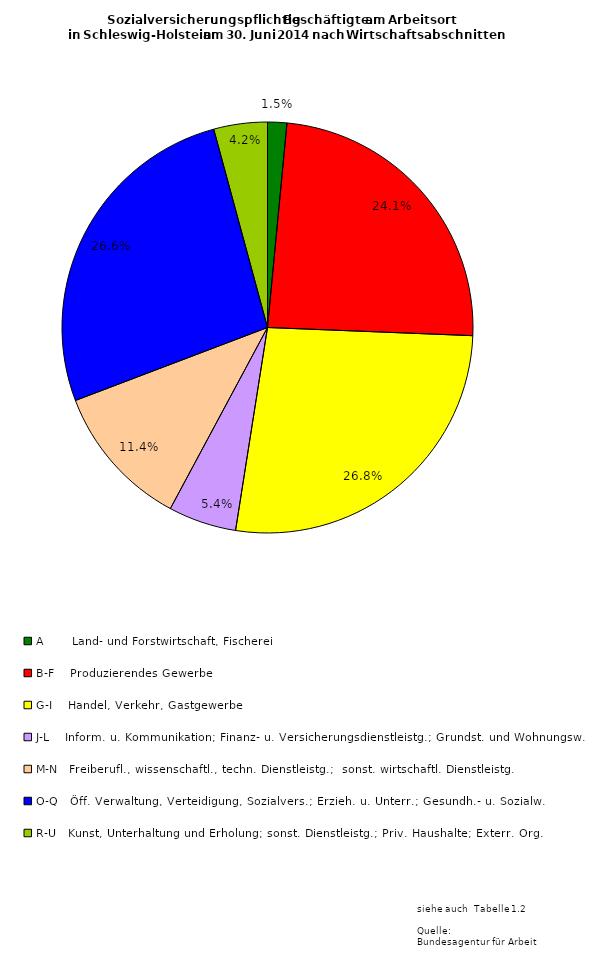
| Category | Series 0 | Series 1 | Series 2 |
|---|---|---|---|
| A       Land- und Forstwirtschaft, Fischerei | 13576 | 3804 | 9772 |
| B-F    Produzierendes Gewerbe | 216386 | 49088 | 167298 |
| G-I    Handel, Verkehr, Gastgewerbe | 240854 | 109180 | 131674 |
| J-L    Inform. u. Kommunikation; Finanz- u. Versicherungsdienstleistg.; Grundst. und Wohnungsw. | 48009 | 23176 | 24833 |
| M-N   Freiberufl., wissenschaftl., techn. Dienstleistg.;  sonst. wirtschaftl. Dienstleistg.  | 102102 | 48046 | 54056 |
| O-Q   Öff. Verwaltung, Verteidigung, Sozialvers.; Erzieh. u. Unterr.; Gesundh.- u. Sozialw. | 238298 | 168749 | 69549 |
| R-U   Kunst, Unterhaltung und Erholung; sonst. Dienstleistg.; Priv. Haushalte; Exterr. Org. | 37821 | 25861 | 11960 |